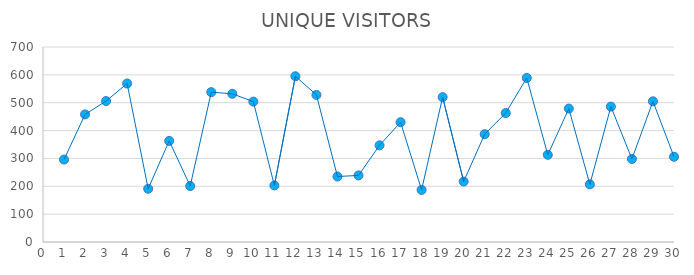
| Category | UNIQUE VISITORS |
|---|---|
| 1.0 | 296 |
| 2.0 | 458 |
| 3.0 | 506 |
| 4.0 | 569 |
| 5.0 | 191 |
| 6.0 | 363 |
| 7.0 | 201 |
| 8.0 | 538 |
| 9.0 | 532 |
| 10.0 | 504 |
| 11.0 | 203 |
| 12.0 | 595 |
| 13.0 | 528 |
| 14.0 | 235 |
| 15.0 | 239 |
| 16.0 | 347 |
| 17.0 | 430 |
| 18.0 | 187 |
| 19.0 | 520 |
| 20.0 | 217 |
| 21.0 | 387 |
| 22.0 | 463 |
| 23.0 | 589 |
| 24.0 | 313 |
| 25.0 | 479 |
| 26.0 | 207 |
| 27.0 | 486 |
| 28.0 | 298 |
| 29.0 | 505 |
| 30.0 | 306 |